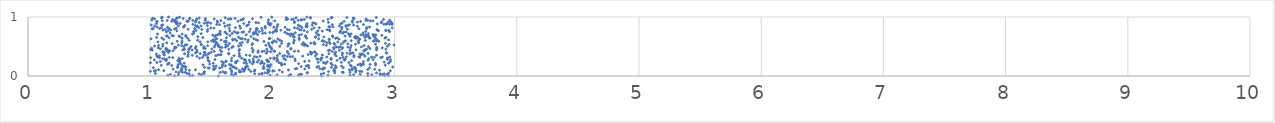
| Category | Series 0 |
|---|---|
| 1.5578485684926808 | 0.001 |
| 2.4021468296798494 | 0.002 |
| 1.1998357419708947 | 0.003 |
| 2.78104376217337 | 0.004 |
| 2.9191206548320117 | 0.005 |
| 1.3246831895094342 | 0.006 |
| 2.9477063046077236 | 0.007 |
| 2.134374419184975 | 0.008 |
| 1.3465346191536143 | 0.009 |
| 1.682977754322935 | 0.01 |
| 1.1446742396201925 | 0.011 |
| 2.455442234134602 | 0.012 |
| 2.2146290130650352 | 0.013 |
| 2.6353675552219995 | 0.014 |
| 1.9809452256569517 | 0.015 |
| 1.2295937864468214 | 0.016 |
| 2.1471356819299565 | 0.017 |
| 2.880128833362008 | 0.018 |
| 2.0380045133074107 | 0.019 |
| 2.6643417995098453 | 0.02 |
| 2.813670925658935 | 0.021 |
| 1.4185499798562946 | 0.022 |
| 2.2285990304879846 | 0.023 |
| 2.1488829586303684 | 0.024 |
| 2.90116098919503 | 0.025 |
| 1.6652909543498882 | 0.026 |
| 1.1657659649259882 | 0.027 |
| 2.2390088964335755 | 0.028 |
| 2.2272227793293915 | 0.029 |
| 2.719198611433096 | 0.03 |
| 2.938714307007358 | 0.031 |
| 1.8930000986881255 | 0.032 |
| 1.7009280996627505 | 0.033 |
| 2.399816477791193 | 0.034 |
| 1.914546944495643 | 0.035 |
| 1.3996847568871496 | 0.036 |
| 2.8828689980413706 | 0.037 |
| 2.9142030677309414 | 0.038 |
| 1.8552242239795202 | 0.039 |
| 1.4410366417329508 | 0.04 |
| 1.317693887241605 | 0.041 |
| 1.0422932186790828 | 0.042 |
| 2.7805935779101834 | 0.043 |
| 1.9145371011594485 | 0.044 |
| 1.3003144363732089 | 0.045 |
| 2.419872586109637 | 0.046 |
| 1.6986009966757687 | 0.047 |
| 2.9512743321165678 | 0.048 |
| 1.9598447148696003 | 0.049 |
| 1.615598879545639 | 0.05 |
| 2.282903807387162 | 0.051 |
| 1.4382426619922037 | 0.052 |
| 2.8519539264998706 | 0.053 |
| 2.5102357027759004 | 0.054 |
| 1.9388505423119102 | 0.055 |
| 1.2342317042883906 | 0.056 |
| 1.6090834345995968 | 0.057 |
| 2.2871483589697514 | 0.058 |
| 1.6172689604497017 | 0.059 |
| 1.5719534413331901 | 0.06 |
| 2.5799137948425996 | 0.061 |
| 1.2850590477027402 | 0.062 |
| 1.2641224725272608 | 0.063 |
| 2.6348167754193694 | 0.064 |
| 2.571557964954439 | 0.065 |
| 1.6671864783275812 | 0.066 |
| 2.080804024978912 | 0.067 |
| 2.6814982386042256 | 0.068 |
| 1.7303004847955676 | 0.069 |
| 1.2112316547413358 | 0.07 |
| 1.7437038602864736 | 0.071 |
| 1.5946967025629413 | 0.072 |
| 1.4440063008681536 | 0.073 |
| 1.9654854305564056 | 0.074 |
| 2.4590504082200506 | 0.075 |
| 2.7319455075718286 | 0.076 |
| 1.8236855455238552 | 0.077 |
| 1.0019311524802037 | 0.078 |
| 1.9733177906248387 | 0.079 |
| 1.7672673230771518 | 0.08 |
| 2.7154262908596367 | 0.081 |
| 1.8528923769018142 | 0.082 |
| 2.5069160436196904 | 0.083 |
| 1.0329827102418665 | 0.084 |
| 2.002812714391278 | 0.085 |
| 1.2500863670526146 | 0.086 |
| 2.014394263445033 | 0.087 |
| 2.9653079881868742 | 0.088 |
| 1.665969582122249 | 0.089 |
| 2.5021055321567123 | 0.09 |
| 1.1113589810225726 | 0.091 |
| 2.683722778653887 | 0.092 |
| 2.5099194654093653 | 0.093 |
| 1.0448095525394112 | 0.094 |
| 1.7302665351392317 | 0.095 |
| 1.3216100271213904 | 0.096 |
| 2.8761957315116176 | 0.097 |
| 1.7691273750013718 | 0.098 |
| 2.0572255141160554 | 0.099 |
| 1.9727391391288616 | 0.1 |
| 2.130963087846583 | 0.101 |
| 1.8562927816258021 | 0.102 |
| 1.9601881142101123 | 0.103 |
| 2.6308190714786823 | 0.104 |
| 2.6526713150951293 | 0.105 |
| 1.3705415242713028 | 0.106 |
| 1.0683913953960749 | 0.107 |
| 1.2586599696806546 | 0.108 |
| 2.7801184904632805 | 0.109 |
| 1.8058474324382008 | 0.11 |
| 1.29195746173539 | 0.111 |
| 1.5228155810161548 | 0.112 |
| 1.516238993882289 | 0.113 |
| 2.410227106205448 | 0.114 |
| 2.8371820767351466 | 0.115 |
| 1.7722535570027482 | 0.116 |
| 1.1874900986576005 | 0.117 |
| 2.2651896956096573 | 0.118 |
| 1.7548064741349167 | 0.119 |
| 2.679974805918337 | 0.12 |
| 2.1869572691300565 | 0.121 |
| 2.388184768098579 | 0.122 |
| 2.5070259366603347 | 0.123 |
| 2.653511136939991 | 0.124 |
| 1.6549072702332834 | 0.125 |
| 1.77650625124326 | 0.126 |
| 2.200034867624352 | 0.127 |
| 1.7058010899386 | 0.128 |
| 1.9243559894583877 | 0.129 |
| 1.2576079139863958 | 0.13 |
| 1.9314855242088642 | 0.131 |
| 2.427224145257079 | 0.132 |
| 1.5327267273030412 | 0.133 |
| 2.415058527449329 | 0.134 |
| 1.483257084275938 | 0.135 |
| 1.5682186470448254 | 0.136 |
| 1.4743884567263161 | 0.137 |
| 2.794724925660654 | 0.138 |
| 2.2986811815186656 | 0.139 |
| 2.5799574271186305 | 0.14 |
| 1.0249596340624014 | 0.141 |
| 2.6760838782083134 | 0.142 |
| 1.6919242739450802 | 0.143 |
| 1.2234940689168237 | 0.144 |
| 2.482693398241122 | 0.145 |
| 2.522502508642797 | 0.146 |
| 2.6729600380919294 | 0.147 |
| 1.44483871654085 | 0.148 |
| 1.9761605158170572 | 0.149 |
| 2.36313140573916 | 0.15 |
| 1.5883110087278687 | 0.151 |
| 1.2850662768149048 | 0.152 |
| 2.9838591676103565 | 0.153 |
| 1.7827708395729664 | 0.154 |
| 1.6757578062480663 | 0.155 |
| 1.6761705910316909 | 0.156 |
| 1.2909437625068252 | 0.157 |
| 1.7839343315833962 | 0.158 |
| 2.235342925083661 | 0.159 |
| 1.9267032543269964 | 0.16 |
| 1.797607885240957 | 0.161 |
| 2.3775083111715247 | 0.162 |
| 1.2742801698670883 | 0.163 |
| 1.9616412355512178 | 0.164 |
| 1.5180419064302653 | 0.165 |
| 1.2261876447030278 | 0.166 |
| 2.6460719507644237 | 0.167 |
| 2.5662994062065296 | 0.168 |
| 1.979420653466727 | 0.169 |
| 1.5398936742894351 | 0.17 |
| 2.276844840563737 | 0.171 |
| 1.6161517160982897 | 0.172 |
| 1.2640434442275676 | 0.173 |
| 2.515664941491801 | 0.174 |
| 2.2957473370705603 | 0.175 |
| 2.726420672694719 | 0.176 |
| 1.1766522555262804 | 0.177 |
| 1.5910960595094434 | 0.178 |
| 2.289374735117619 | 0.179 |
| 1.9621822214269196 | 0.18 |
| 1.0905789269629957 | 0.181 |
| 2.923744777428043 | 0.182 |
| 1.6595947284944057 | 0.183 |
| 2.636738841624166 | 0.184 |
| 2.844277652241945 | 0.185 |
| 2.0786312377740552 | 0.186 |
| 2.4907457470029923 | 0.187 |
| 1.6620618459818006 | 0.188 |
| 1.4315850901080347 | 0.189 |
| 2.7006257807285596 | 0.19 |
| 2.074599132445179 | 0.191 |
| 2.7266975429787905 | 0.192 |
| 1.9868499247334428 | 0.193 |
| 1.648273241900906 | 0.194 |
| 1.2293874838040304 | 0.195 |
| 2.7989765243779283 | 0.196 |
| 1.594420457697746 | 0.197 |
| 2.7431726496624336 | 0.198 |
| 1.1414178629726213 | 0.199 |
| 2.740804093161112 | 0.2 |
| 1.4875650121836468 | 0.201 |
| 2.0998852414901057 | 0.202 |
| 2.7185339802062596 | 0.203 |
| 2.7433772231263847 | 0.204 |
| 1.250948374736513 | 0.205 |
| 1.8376127220877632 | 0.206 |
| 1.7887971846514086 | 0.207 |
| 1.1514058077877358 | 0.208 |
| 2.2144867363446394 | 0.209 |
| 1.931981203095362 | 0.21 |
| 1.9021810929408256 | 0.211 |
| 2.436232793526475 | 0.212 |
| 2.480010176111634 | 0.213 |
| 2.843357056201497 | 0.214 |
| 2.9496238260370755 | 0.215 |
| 1.515509614477633 | 0.216 |
| 1.278398236189356 | 0.217 |
| 2.072593150076293 | 0.218 |
| 1.1549011402143856 | 0.219 |
| 1.9149403804478853 | 0.22 |
| 1.7672253800203723 | 0.221 |
| 2.422125173084752 | 0.222 |
| 1.7009997496777367 | 0.223 |
| 1.0019735280699538 | 0.224 |
| 1.699409984326314 | 0.225 |
| 2.054388305546783 | 0.226 |
| 1.601989530291157 | 0.227 |
| 2.6259547129489995 | 0.228 |
| 1.0553562812541413 | 0.229 |
| 2.4184198711006255 | 0.23 |
| 2.3748675005087936 | 0.231 |
| 2.5645989365082924 | 0.232 |
| 1.8170928128210848 | 0.233 |
| 1.2415106975760846 | 0.234 |
| 2.9150379907534387 | 0.235 |
| 1.8487898797783977 | 0.236 |
| 1.6986260586754618 | 0.237 |
| 1.8764946082543381 | 0.238 |
| 1.7834150242587963 | 0.239 |
| 2.449160733734085 | 0.24 |
| 1.969173595041663 | 0.241 |
| 2.9649081520859775 | 0.242 |
| 2.7448043833932925 | 0.243 |
| 1.5852728476998748 | 0.244 |
| 1.083023696478145 | 0.245 |
| 1.483561652373297 | 0.246 |
| 1.620811376230353 | 0.247 |
| 2.2639873156740706 | 0.248 |
| 1.9137040345778338 | 0.249 |
| 1.958633391282273 | 0.25 |
| 1.8431285333226932 | 0.251 |
| 2.0365051463136457 | 0.252 |
| 1.6213204281376374 | 0.253 |
| 1.243654526372964 | 0.254 |
| 1.7135377358898498 | 0.255 |
| 2.300809446607733 | 0.256 |
| 1.6647572399428283 | 0.257 |
| 1.1314646852493242 | 0.258 |
| 1.9652795448657687 | 0.259 |
| 2.6479202112557587 | 0.26 |
| 2.1864025659758646 | 0.261 |
| 1.2323325000230885 | 0.262 |
| 1.2257735720137883 | 0.263 |
| 2.5299188363305465 | 0.264 |
| 2.7825354378133076 | 0.265 |
| 1.4729077074935597 | 0.266 |
| 2.5892521757060285 | 0.267 |
| 1.811094768257954 | 0.268 |
| 2.396580323300255 | 0.269 |
| 1.8884263060291502 | 0.27 |
| 2.0433401189183624 | 0.271 |
| 1.0337185678956717 | 0.272 |
| 1.9531371120892456 | 0.273 |
| 1.7783454918185424 | 0.274 |
| 2.9671063382936476 | 0.275 |
| 2.107733032971038 | 0.276 |
| 2.82305332712681 | 0.277 |
| 1.530117069873865 | 0.278 |
| 1.7686077367031767 | 0.279 |
| 2.9418111205859514 | 0.28 |
| 2.5963102539750613 | 0.281 |
| 2.481495547803352 | 0.282 |
| 2.372786723715199 | 0.283 |
| 2.5907052106962434 | 0.284 |
| 1.1336361336402871 | 0.285 |
| 1.2445615244618164 | 0.286 |
| 1.119341655161793 | 0.287 |
| 2.0148905661716983 | 0.288 |
| 1.843384874890879 | 0.289 |
| 2.362860234207819 | 0.29 |
| 2.184597398482745 | 0.291 |
| 2.787822004911545 | 0.292 |
| 1.102693640224266 | 0.293 |
| 2.0954384380144786 | 0.294 |
| 1.2636592722299687 | 0.295 |
| 2.396526527222774 | 0.296 |
| 2.480407618848928 | 0.297 |
| 1.2366284954656248 | 0.298 |
| 2.5529869898435047 | 0.299 |
| 1.9833049062688182 | 0.3 |
| 1.6666050562135921 | 0.301 |
| 1.4042251109455934 | 0.302 |
| 1.7474879243692094 | 0.303 |
| 2.0357205702745294 | 0.304 |
| 2.9410892587267643 | 0.305 |
| 2.0125288538374857 | 0.306 |
| 1.4713145411461817 | 0.307 |
| 2.4054358037419696 | 0.308 |
| 1.0761875321068575 | 0.309 |
| 1.0038251882115274 | 0.31 |
| 2.887244926929121 | 0.311 |
| 1.1843089436449117 | 0.312 |
| 1.4711947132793761 | 0.313 |
| 1.4275072535799438 | 0.314 |
| 2.5763465880181147 | 0.315 |
| 1.156782814826912 | 0.316 |
| 2.716311103176273 | 0.317 |
| 2.8346186159359403 | 0.318 |
| 2.8114370095132664 | 0.319 |
| 1.8736582930788495 | 0.32 |
| 2.9598248194916392 | 0.321 |
| 2.4450251726828336 | 0.322 |
| 2.899281704411078 | 0.323 |
| 1.0595972743934485 | 0.324 |
| 2.6048681707043526 | 0.325 |
| 2.6661852328666065 | 0.326 |
| 2.1453263598959094 | 0.327 |
| 2.7075135338310243 | 0.328 |
| 2.121889591623061 | 0.329 |
| 1.85459801766754 | 0.33 |
| 2.165138892333929 | 0.331 |
| 1.3822530059581069 | 0.332 |
| 1.3085550795429364 | 0.333 |
| 1.7298338146657002 | 0.334 |
| 1.8991528499238777 | 0.335 |
| 2.757708033329113 | 0.336 |
| 2.2477930066777785 | 0.337 |
| 1.0547959634623691 | 0.338 |
| 2.084209249224476 | 0.339 |
| 2.5219787108342873 | 0.34 |
| 2.3516465635052395 | 0.341 |
| 1.0752538339653253 | 0.342 |
| 1.5367329150594082 | 0.343 |
| 1.6858526941610843 | 0.344 |
| 1.7320771952845073 | 0.345 |
| 2.0413044799649915 | 0.346 |
| 2.0998231223259323 | 0.347 |
| 1.8148350180235548 | 0.348 |
| 1.4375901667144433 | 0.349 |
| 1.344671292611956 | 0.35 |
| 2.6673941312036717 | 0.351 |
| 1.453497082714073 | 0.352 |
| 2.8524586091677127 | 0.353 |
| 1.7848976712609361 | 0.354 |
| 2.409182012275596 | 0.355 |
| 1.1163149187353112 | 0.356 |
| 2.572039787829377 | 0.357 |
| 1.5534559886864394 | 0.358 |
| 1.5720817045748596 | 0.359 |
| 1.5783116918531352 | 0.36 |
| 2.7470253368702444 | 0.361 |
| 2.7270502251109203 | 0.362 |
| 1.3111954543743758 | 0.363 |
| 2.29293945875248 | 0.364 |
| 2.509874819385741 | 0.365 |
| 2.723766022600829 | 0.366 |
| 1.1098654295242596 | 0.367 |
| 1.4723206709667802 | 0.368 |
| 2.3641492472432404 | 0.369 |
| 2.3168147733494386 | 0.37 |
| 2.1336007501131053 | 0.371 |
| 1.0502517396640354 | 0.372 |
| 1.6443797256589048 | 0.373 |
| 2.633833781064081 | 0.374 |
| 2.7165689319558455 | 0.375 |
| 2.7325919682180637 | 0.376 |
| 2.462298311993283 | 0.377 |
| 1.2814531486541723 | 0.378 |
| 1.4090915027158728 | 0.379 |
| 2.0601509175862773 | 0.38 |
| 1.7289413212794924 | 0.381 |
| 1.4799336774157021 | 0.382 |
| 2.782433811174811 | 0.383 |
| 1.6403392432612827 | 0.384 |
| 1.9500438331773904 | 0.385 |
| 2.9358632073646467 | 0.386 |
| 2.6424454186976813 | 0.387 |
| 2.6103129792409936 | 0.388 |
| 2.5109836398463585 | 0.389 |
| 2.573216918800969 | 0.39 |
| 1.37132563242546 | 0.391 |
| 2.3237002610121262 | 0.392 |
| 2.3195166829180662 | 0.393 |
| 2.658724649491527 | 0.394 |
| 1.4483029008840114 | 0.395 |
| 2.932721108983742 | 0.396 |
| 1.1164037912109157 | 0.397 |
| 1.1489594894049593 | 0.398 |
| 1.4412270664260773 | 0.399 |
| 2.3519325030151013 | 0.4 |
| 1.8823940130530115 | 0.401 |
| 1.4986744944469068 | 0.402 |
| 2.1230778389055134 | 0.403 |
| 2.518089423945017 | 0.404 |
| 1.3118829636165554 | 0.405 |
| 1.1060837433241282 | 0.406 |
| 1.1035427923039396 | 0.407 |
| 2.3108832457544692 | 0.408 |
| 2.3434371574986237 | 0.409 |
| 1.3845049632917967 | 0.41 |
| 1.8393290898420978 | 0.411 |
| 1.9852160261933505 | 0.412 |
| 1.584257118576397 | 0.413 |
| 1.915725783371261 | 0.414 |
| 2.123257079943218 | 0.415 |
| 1.9600731078945997 | 0.416 |
| 2.488696609066284 | 0.417 |
| 1.5219763835738647 | 0.418 |
| 2.0187667143052486 | 0.419 |
| 2.1812987431323756 | 0.42 |
| 2.21259981236219 | 0.421 |
| 1.932845275145927 | 0.422 |
| 1.1592655438667125 | 0.423 |
| 2.0125402164562436 | 0.424 |
| 2.7473286185268284 | 0.425 |
| 1.8840207185345388 | 0.426 |
| 1.186416466539042 | 0.427 |
| 2.7543990817983848 | 0.428 |
| 1.1363416804566953 | 0.429 |
| 1.7274732537208446 | 0.43 |
| 1.1491848578750432 | 0.431 |
| 2.4577429997640756 | 0.432 |
| 2.6345831996322326 | 0.433 |
| 2.5489403509101005 | 0.434 |
| 1.140624010727608 | 0.435 |
| 1.5742423621099622 | 0.436 |
| 2.4684201088584565 | 0.437 |
| 1.0162218634193665 | 0.438 |
| 1.8426819163189943 | 0.439 |
| 1.34331219421754 | 0.44 |
| 1.3816899101616844 | 0.441 |
| 1.2659778304384983 | 0.442 |
| 2.8520892841636383 | 0.443 |
| 2.6839660503364415 | 0.444 |
| 1.3158431287025227 | 0.445 |
| 2.7591730656343882 | 0.446 |
| 1.1398215080504048 | 0.447 |
| 1.003519289484071 | 0.448 |
| 1.128091139957139 | 0.449 |
| 1.7310517529660236 | 0.45 |
| 1.2802537356749493 | 0.451 |
| 2.7714362411502718 | 0.452 |
| 1.276555171606718 | 0.453 |
| 1.6434155065283989 | 0.454 |
| 2.1510497619722937 | 0.455 |
| 2.9282726522062896 | 0.456 |
| 1.9540172655057473 | 0.457 |
| 1.504541036925658 | 0.458 |
| 1.9935572918604214 | 0.459 |
| 2.5032855916431416 | 0.46 |
| 1.3185659075796934 | 0.461 |
| 1.081867341647914 | 0.462 |
| 2.5700450351925 | 0.463 |
| 1.199266990212583 | 0.464 |
| 1.4499654746114183 | 0.465 |
| 2.797714830799663 | 0.466 |
| 2.1519379324299304 | 0.467 |
| 2.8542888116579945 | 0.468 |
| 1.3235221787880582 | 0.469 |
| 1.0117279104576617 | 0.47 |
| 1.130281102230804 | 0.471 |
| 1.83323034290964 | 0.472 |
| 1.437003565526461 | 0.473 |
| 1.369517039166278 | 0.474 |
| 2.505728037191795 | 0.475 |
| 2.898721855580485 | 0.476 |
| 2.6382271698459934 | 0.477 |
| 1.987530396249518 | 0.478 |
| 1.0657612495477196 | 0.479 |
| 2.5736029685704205 | 0.48 |
| 2.5013579951591165 | 0.481 |
| 1.6676426927932715 | 0.482 |
| 1.586857632483822 | 0.483 |
| 1.2115936980816226 | 0.484 |
| 2.542907011020099 | 0.485 |
| 2.8544127340807934 | 0.486 |
| 1.6166732012005625 | 0.487 |
| 1.5684342412149392 | 0.488 |
| 2.618334360614093 | 0.489 |
| 1.2010295346896627 | 0.49 |
| 2.524445855902427 | 0.491 |
| 1.5254313188307442 | 0.492 |
| 2.729160083017719 | 0.493 |
| 2.5534393063421352 | 0.494 |
| 1.9821072105724789 | 0.495 |
| 1.4398712157195517 | 0.496 |
| 1.2769871230745882 | 0.497 |
| 2.785199661681169 | 0.498 |
| 1.3751954414791536 | 0.499 |
| 1.678576929029321 | 0.5 |
| 1.3345273633524506 | 0.501 |
| 1.5631649799070904 | 0.502 |
| 2.0608582084204263 | 0.503 |
| 1.1026156778690497 | 0.504 |
| 2.9415250524465786 | 0.505 |
| 2.1270488028003545 | 0.506 |
| 1.7231229696117902 | 0.507 |
| 1.0363455104954464 | 0.508 |
| 2.287220091523494 | 0.509 |
| 1.6274740332177 | 0.51 |
| 1.5578705456087298 | 0.511 |
| 1.4703699353918598 | 0.512 |
| 1.2584795641170232 | 0.513 |
| 1.6354797077597232 | 0.514 |
| 2.6439929536022575 | 0.515 |
| 2.2611822448230683 | 0.516 |
| 2.7500236825441897 | 0.517 |
| 1.0685925312524969 | 0.518 |
| 2.441980361261912 | 0.519 |
| 1.9455234189452613 | 0.52 |
| 1.744546914863759 | 0.521 |
| 1.9726358699937663 | 0.522 |
| 1.2299991414793927 | 0.523 |
| 1.5310523195292638 | 0.524 |
| 2.9950241824956896 | 0.525 |
| 1.557166244069799 | 0.526 |
| 2.2740768538651714 | 0.527 |
| 1.285741646136607 | 0.528 |
| 1.419075051348379 | 0.529 |
| 1.300237552120345 | 0.53 |
| 1.6175525743807582 | 0.531 |
| 2.4168059905676387 | 0.532 |
| 2.51093464508866 | 0.533 |
| 1.832801046014133 | 0.534 |
| 2.955992591704476 | 0.535 |
| 2.243223322787589 | 0.536 |
| 2.266403380534379 | 0.537 |
| 2.6807292582754627 | 0.538 |
| 2.843866396194366 | 0.539 |
| 1.104374480074572 | 0.54 |
| 1.4162154300007892 | 0.541 |
| 2.563495434997925 | 0.542 |
| 2.138220060960455 | 0.543 |
| 2.6170086503211483 | 0.544 |
| 2.3496809525138738 | 0.545 |
| 2.130538315038993 | 0.546 |
| 1.8382642539313248 | 0.547 |
| 2.4719788913822294 | 0.548 |
| 1.179954707181031 | 0.549 |
| 2.0746733962605726 | 0.55 |
| 2.3401449538563215 | 0.551 |
| 1.6486970354408284 | 0.552 |
| 2.9259563698205127 | 0.553 |
| 2.504689249711763 | 0.554 |
| 1.7337724169272744 | 0.555 |
| 1.9687601025644166 | 0.556 |
| 2.3135851400780005 | 0.557 |
| 1.5420993872556845 | 0.558 |
| 1.2584241055743166 | 0.559 |
| 1.5460362211158618 | 0.56 |
| 2.706686781574004 | 0.561 |
| 1.1348435450609993 | 0.562 |
| 2.173406945530863 | 0.563 |
| 2.446203326802147 | 0.564 |
| 2.000135057883524 | 0.565 |
| 2.2532211346578688 | 0.566 |
| 2.3420309626799627 | 0.567 |
| 2.5811575553411013 | 0.568 |
| 1.753550214076353 | 0.569 |
| 1.5391646737391345 | 0.57 |
| 2.4665222843478265 | 0.571 |
| 2.173897445617845 | 0.572 |
| 1.9988613827756438 | 0.573 |
| 1.6228566734295082 | 0.574 |
| 1.7975011985765368 | 0.575 |
| 2.535511124469511 | 0.576 |
| 1.0636060880796245 | 0.577 |
| 1.471251353819856 | 0.578 |
| 2.031429497706932 | 0.579 |
| 1.4079411909943573 | 0.58 |
| 1.520264305266223 | 0.581 |
| 2.700701560981731 | 0.582 |
| 2.4271043810971333 | 0.583 |
| 1.606407750070013 | 0.584 |
| 1.9307133333821411 | 0.585 |
| 2.8708521296176412 | 0.586 |
| 2.5887327160055382 | 0.587 |
| 2.8271474699765062 | 0.588 |
| 1.220790026062791 | 0.589 |
| 1.261024470623068 | 0.59 |
| 2.0758283031157747 | 0.591 |
| 2.852041571111399 | 0.592 |
| 2.406294617636333 | 0.593 |
| 1.6195413026575538 | 0.594 |
| 1.5023214106617055 | 0.595 |
| 2.015190540896886 | 0.596 |
| 2.5976952386477485 | 0.597 |
| 2.6449427415476148 | 0.598 |
| 1.7069606010752045 | 0.599 |
| 2.410899869520236 | 0.6 |
| 2.8325720297150303 | 0.601 |
| 2.760718822269694 | 0.602 |
| 2.8597401217012437 | 0.603 |
| 1.879362572871153 | 0.604 |
| 1.3188563246340628 | 0.605 |
| 2.1788487052050938 | 0.606 |
| 1.3877347521560124 | 0.607 |
| 2.059821368689267 | 0.608 |
| 1.5798236269019934 | 0.609 |
| 1.6753000853690454 | 0.61 |
| 2.709530997395996 | 0.611 |
| 1.8028143974801245 | 0.612 |
| 2.951115397326766 | 0.613 |
| 1.5157847629281938 | 0.614 |
| 1.531806044643003 | 0.615 |
| 1.8659635291414995 | 0.616 |
| 2.464348417830565 | 0.617 |
| 2.2197628724268617 | 0.618 |
| 2.7090170970033007 | 0.619 |
| 1.110273074109831 | 0.62 |
| 1.6937875956748945 | 0.621 |
| 1.7776070976101075 | 0.622 |
| 1.6747136018975308 | 0.623 |
| 2.8502276862684166 | 0.624 |
| 2.5449235690124787 | 0.625 |
| 2.4646684326473363 | 0.626 |
| 2.714211338922909 | 0.627 |
| 2.0443048867285443 | 0.628 |
| 2.3789911235763515 | 0.629 |
| 1.007426845870317 | 0.63 |
| 1.5456700674600865 | 0.631 |
| 1.7540381705871824 | 0.632 |
| 1.9732260286017518 | 0.633 |
| 1.8478100421224337 | 0.634 |
| 1.7386049475028005 | 0.635 |
| 1.979849619236217 | 0.636 |
| 2.5164343922383354 | 0.637 |
| 1.2616451024030348 | 0.638 |
| 2.684040117145287 | 0.639 |
| 2.279929151169437 | 0.64 |
| 2.7989433060571898 | 0.641 |
| 2.920989795755224 | 0.642 |
| 1.3057356643684672 | 0.643 |
| 2.7928487574786978 | 0.644 |
| 1.0951017942245178 | 0.645 |
| 2.219956653588037 | 0.646 |
| 2.528803968052343 | 0.647 |
| 1.154595466851527 | 0.648 |
| 1.6239717854166273 | 0.649 |
| 2.677854658898286 | 0.65 |
| 2.8400700046023593 | 0.651 |
| 1.430852647551959 | 0.652 |
| 1.0522600297560487 | 0.653 |
| 2.758192783275268 | 0.654 |
| 2.929146682888928 | 0.655 |
| 2.6966073959116956 | 0.656 |
| 2.3506381155336253 | 0.657 |
| 1.7221935373226571 | 0.658 |
| 2.1707835860773472 | 0.659 |
| 2.788606320060078 | 0.66 |
| 2.673093178665182 | 0.661 |
| 2.420767121366075 | 0.662 |
| 2.179836067284546 | 0.663 |
| 1.5295288091119421 | 0.664 |
| 2.355454627985983 | 0.665 |
| 2.4941641895938833 | 0.666 |
| 1.3894593947365994 | 0.667 |
| 1.2431181690517816 | 0.668 |
| 1.8244280998682594 | 0.669 |
| 2.6831725259664987 | 0.67 |
| 2.2698437284871975 | 0.671 |
| 2.6361037305694355 | 0.672 |
| 2.830509055944967 | 0.673 |
| 1.2908409341878015 | 0.674 |
| 2.773084552313119 | 0.675 |
| 1.1332184873556959 | 0.676 |
| 2.5942108757620934 | 0.677 |
| 1.2354800480748753 | 0.678 |
| 1.1899933552517037 | 0.679 |
| 1.1396807417007888 | 0.68 |
| 2.4912405371839235 | 0.681 |
| 2.147373192399202 | 0.682 |
| 2.271345738999107 | 0.683 |
| 1.1794124788251648 | 0.684 |
| 2.7854449306128872 | 0.685 |
| 1.6528666998730726 | 0.686 |
| 1.5346351545501176 | 0.687 |
| 1.2913031355326823 | 0.688 |
| 2.8953062252466393 | 0.689 |
| 2.745568457970602 | 0.69 |
| 2.3802331423001952 | 0.691 |
| 2.217216688684629 | 0.692 |
| 1.5114608111900065 | 0.693 |
| 2.8461347321610315 | 0.694 |
| 1.5502930946206492 | 0.695 |
| 2.8322570474420115 | 0.696 |
| 2.6295843267350727 | 0.697 |
| 2.7242077541076646 | 0.698 |
| 1.7864064975143652 | 0.699 |
| 2.762817929262742 | 0.7 |
| 1.8788398284339356 | 0.701 |
| 2.1673689839532386 | 0.702 |
| 2.2372652104714685 | 0.703 |
| 2.8227433458332962 | 0.704 |
| 1.5736496706796992 | 0.705 |
| 2.371134964131792 | 0.706 |
| 2.168917033331387 | 0.707 |
| 1.345458958632219 | 0.708 |
| 1.844228516448972 | 0.709 |
| 2.1349497183066433 | 0.71 |
| 1.2618920287737039 | 0.711 |
| 1.628994588003974 | 0.712 |
| 1.060016979974696 | 0.713 |
| 2.6436449971709997 | 0.714 |
| 1.5663183876585502 | 0.715 |
| 2.156120481388158 | 0.716 |
| 1.4171181819427632 | 0.717 |
| 2.622708497046098 | 0.718 |
| 2.784792174503832 | 0.719 |
| 2.1193477517920716 | 0.72 |
| 1.8548802712030206 | 0.721 |
| 1.670121744463841 | 0.722 |
| 1.920835544303955 | 0.723 |
| 2.5747573702930255 | 0.724 |
| 1.8671213188586484 | 0.725 |
| 1.3575267142117688 | 0.726 |
| 1.9416743296589638 | 0.727 |
| 1.1633851577274128 | 0.728 |
| 1.7147934762765304 | 0.729 |
| 1.570707656545409 | 0.73 |
| 2.742163820114815 | 0.731 |
| 1.7065820079180432 | 0.732 |
| 2.1876909236539355 | 0.733 |
| 1.7184074446718638 | 0.734 |
| 2.35807429339145 | 0.735 |
| 1.8449806887563458 | 0.736 |
| 1.979121927436877 | 0.737 |
| 2.0029338269410424 | 0.738 |
| 2.551753362012442 | 0.739 |
| 1.6148371247871174 | 0.74 |
| 1.752544851711544 | 0.741 |
| 2.1014435317043993 | 0.742 |
| 2.583925409311285 | 0.743 |
| 1.6120804794078805 | 0.744 |
| 2.6025246152576837 | 0.745 |
| 2.2867052218143753 | 0.746 |
| 1.76515756242468 | 0.747 |
| 1.1326130887226382 | 0.748 |
| 1.8117855462925805 | 0.749 |
| 2.9588837235487038 | 0.75 |
| 1.8927840186430887 | 0.751 |
| 2.558143487379368 | 0.752 |
| 1.6876515868619781 | 0.753 |
| 1.3550987062487312 | 0.754 |
| 2.7632880396690926 | 0.755 |
| 2.0178126541853088 | 0.756 |
| 2.0341554953499834 | 0.757 |
| 1.4677988207082426 | 0.758 |
| 2.554511262954936 | 0.759 |
| 1.5724091861681033 | 0.76 |
| 2.408417805608444 | 0.761 |
| 2.4705979550967023 | 0.762 |
| 1.8645771807381788 | 0.763 |
| 1.651274874419584 | 0.764 |
| 1.218305045401034 | 0.765 |
| 2.3720400958395973 | 0.766 |
| 2.866853756052884 | 0.767 |
| 1.9173032467704938 | 0.768 |
| 1.1469940070605895 | 0.769 |
| 2.928276574412732 | 0.77 |
| 1.3742246548714794 | 0.771 |
| 2.25998469680128 | 0.772 |
| 2.9524333317690243 | 0.773 |
| 2.9279236772334665 | 0.774 |
| 2.8638289406446855 | 0.775 |
| 2.069491521971453 | 0.776 |
| 1.8708300121971584 | 0.777 |
| 1.1057340199115981 | 0.778 |
| 1.1673334674547349 | 0.779 |
| 2.2349386009129715 | 0.78 |
| 2.4654658473597633 | 0.781 |
| 2.0270643421761187 | 0.782 |
| 2.1387928205904614 | 0.783 |
| 2.446981129819185 | 0.784 |
| 2.8552960321685377 | 0.785 |
| 2.2225807491230336 | 0.786 |
| 2.121066464762001 | 0.787 |
| 1.4710110335019937 | 0.788 |
| 1.4226093320510236 | 0.789 |
| 2.3213828400105925 | 0.79 |
| 1.1227754902556375 | 0.791 |
| 2.614206478918348 | 0.792 |
| 1.3104989184916476 | 0.793 |
| 1.8199457962636194 | 0.794 |
| 2.032651303137494 | 0.795 |
| 1.198651192371063 | 0.796 |
| 1.0159039636581737 | 0.797 |
| 2.5676732388842067 | 0.798 |
| 1.8771960867262398 | 0.799 |
| 2.708301418975634 | 0.8 |
| 2.770865112595232 | 0.801 |
| 1.3643006211686133 | 0.802 |
| 1.0241748881808304 | 0.803 |
| 1.0776957407559318 | 0.804 |
| 1.868737632042121 | 0.805 |
| 1.155047674883216 | 0.806 |
| 1.913954317862165 | 0.807 |
| 1.6469869409955282 | 0.808 |
| 2.204992605375013 | 0.809 |
| 1.7387202655166365 | 0.81 |
| 1.5221898544861086 | 0.811 |
| 1.2135739907123266 | 0.812 |
| 2.9802647920036067 | 0.813 |
| 1.496090855146965 | 0.814 |
| 1.9425074386183825 | 0.815 |
| 2.340297642394137 | 0.816 |
| 2.1806500196946743 | 0.817 |
| 2.383334140714103 | 0.818 |
| 1.0930905636074548 | 0.819 |
| 1.697099824930413 | 0.82 |
| 1.3975756796521186 | 0.821 |
| 2.241288161548961 | 0.822 |
| 2.771412018072347 | 0.823 |
| 2.5678264034971123 | 0.824 |
| 1.1409349786872396 | 0.825 |
| 2.1035892656931185 | 0.826 |
| 2.012698360327726 | 0.827 |
| 1.0571624296128075 | 0.828 |
| 1.2726891191793392 | 0.829 |
| 2.795343424621564 | 0.83 |
| 2.471740240989183 | 0.831 |
| 1.2747674990774207 | 0.832 |
| 2.4969491835444932 | 0.833 |
| 1.3846048171606289 | 0.834 |
| 2.2752553494250174 | 0.835 |
| 2.461935946818153 | 0.836 |
| 1.3855039153256554 | 0.837 |
| 2.0392216295099175 | 0.838 |
| 2.602798916868384 | 0.839 |
| 1.9408842771403327 | 0.84 |
| 2.286324555825103 | 0.841 |
| 1.6114852819800771 | 0.842 |
| 2.69541115885064 | 0.843 |
| 1.0358697129157017 | 0.844 |
| 1.384230795130765 | 0.845 |
| 2.2256569443932634 | 0.846 |
| 1.416321008905472 | 0.847 |
| 1.7321643878728001 | 0.848 |
| 2.5483784770179483 | 0.849 |
| 1.2313011033054084 | 0.85 |
| 2.2798866307946986 | 0.851 |
| 1.790256723631974 | 0.852 |
| 2.601310321490076 | 0.853 |
| 1.4678249458566248 | 0.854 |
| 1.3699655489454978 | 0.855 |
| 1.2825777498825355 | 0.856 |
| 1.0925539757169516 | 0.857 |
| 1.6341897673748638 | 0.858 |
| 2.6184940426840906 | 0.859 |
| 2.325271215264552 | 0.86 |
| 2.211274927438801 | 0.861 |
| 1.982960684451656 | 0.862 |
| 2.6644797300966503 | 0.863 |
| 1.0089497410679742 | 0.864 |
| 1.6496096368464117 | 0.865 |
| 1.1030798732467084 | 0.866 |
| 2.2792453178689867 | 0.867 |
| 2.62983928333358 | 0.868 |
| 1.803375633877977 | 0.869 |
| 2.489303046666997 | 0.87 |
| 1.5663267496976219 | 0.871 |
| 2.0432170647577204 | 0.872 |
| 2.745300483772283 | 0.873 |
| 1.5437855086650352 | 0.874 |
| 2.9794944093034306 | 0.875 |
| 1.3499417822625137 | 0.876 |
| 2.9125184010673744 | 0.877 |
| 2.958357380658467 | 0.878 |
| 2.92792803035149 | 0.879 |
| 1.9680062412412695 | 0.88 |
| 2.936503761868875 | 0.881 |
| 2.35672376306335 | 0.882 |
| 2.8588830297158916 | 0.883 |
| 1.050416000426514 | 0.884 |
| 1.2159470281149596 | 0.885 |
| 2.5595994140711875 | 0.886 |
| 2.2837629148080087 | 0.887 |
| 1.9866690725066545 | 0.888 |
| 1.7657405843857303 | 0.889 |
| 1.2458470771635866 | 0.89 |
| 1.9689216758433192 | 0.891 |
| 1.4950142859367652 | 0.892 |
| 1.4434840328031793 | 0.893 |
| 2.979216669333507 | 0.894 |
| 1.222773160214635 | 0.895 |
| 1.604637405838311 | 0.896 |
| 2.569859896459292 | 0.897 |
| 1.4640443718379104 | 0.898 |
| 2.344541056067878 | 0.899 |
| 2.3300039233966716 | 0.9 |
| 1.8862544445128198 | 0.901 |
| 2.890919472886195 | 0.902 |
| 2.972877267926311 | 0.903 |
| 1.2092429662358253 | 0.904 |
| 2.1807613614081536 | 0.905 |
| 1.8655221345993767 | 0.906 |
| 1.4010761603938613 | 0.907 |
| 1.9659633174102702 | 0.908 |
| 2.4580859968983937 | 0.909 |
| 2.654097156545683 | 0.91 |
| 2.9468272247235388 | 0.911 |
| 1.4752402394818622 | 0.912 |
| 1.8108970267688211 | 0.913 |
| 2.6963716835194362 | 0.914 |
| 1.5508353278176217 | 0.915 |
| 1.2095943617874159 | 0.916 |
| 1.370412321924476 | 0.917 |
| 2.89409445588264 | 0.918 |
| 1.218362492454964 | 0.919 |
| 1.0562860340504963 | 0.92 |
| 2.180164767006792 | 0.921 |
| 2.9690659194748745 | 0.922 |
| 1.0522296652850691 | 0.923 |
| 2.7219862559163968 | 0.924 |
| 1.3061609228742272 | 0.925 |
| 2.5862751445593286 | 0.926 |
| 1.1763824787793202 | 0.927 |
| 1.7183157828285687 | 0.928 |
| 1.5482685610348124 | 0.929 |
| 1.1968998133409272 | 0.93 |
| 1.2998162712509425 | 0.931 |
| 2.4158318735633584 | 0.932 |
| 2.8227223181314103 | 0.933 |
| 2.020185578398811 | 0.934 |
| 2.8022022809740434 | 0.935 |
| 1.312030997785339 | 0.936 |
| 1.0994503954920998 | 0.937 |
| 2.655419451205389 | 0.938 |
| 1.5785177569063091 | 0.939 |
| 1.1391328852210507 | 0.94 |
| 1.3482716379441668 | 0.941 |
| 2.76524851759475 | 0.942 |
| 2.210816178960635 | 0.943 |
| 1.4504483382827595 | 0.944 |
| 2.7795798180701166 | 0.945 |
| 1.3765883824055545 | 0.946 |
| 2.9595090989227213 | 0.947 |
| 1.0129675459934986 | 0.948 |
| 2.232590671932869 | 0.949 |
| 1.741455861068442 | 0.95 |
| 2.241850517792383 | 0.951 |
| 1.9685543225702287 | 0.952 |
| 1.204178103563696 | 0.953 |
| 2.2399198569292595 | 0.954 |
| 2.1126670845403 | 0.955 |
| 1.7562695361947052 | 0.956 |
| 1.1830406361742634 | 0.957 |
| 2.909414780383538 | 0.958 |
| 2.156779464601087 | 0.959 |
| 2.2616430702786303 | 0.96 |
| 2.45447650763837 | 0.961 |
| 2.1719443905224702 | 0.962 |
| 1.637909543259839 | 0.963 |
| 1.6618030277721532 | 0.964 |
| 2.125072213269898 | 0.965 |
| 2.766244775986851 | 0.966 |
| 1.3807743908176862 | 0.967 |
| 1.5241795972081476 | 0.968 |
| 1.0356402895491983 | 0.969 |
| 1.7625143081974672 | 0.97 |
| 1.8370646801453536 | 0.971 |
| 1.655587279519794 | 0.972 |
| 1.4520197678326385 | 0.973 |
| 2.669093450532526 | 0.974 |
| 1.2698389781246011 | 0.975 |
| 1.3236507755313716 | 0.976 |
| 1.6950113496358765 | 0.977 |
| 1.3237465374539137 | 0.978 |
| 1.0196224896095256 | 0.979 |
| 1.2176198037863386 | 0.98 |
| 2.3115149546400255 | 0.981 |
| 2.6616018879211034 | 0.982 |
| 1.4011559980562394 | 0.983 |
| 1.2210532582145939 | 0.984 |
| 2.481245601686425 | 0.985 |
| 1.0925282516136345 | 0.986 |
| 2.1939319302642497 | 0.987 |
| 1.6141249193892704 | 0.988 |
| 2.1135985768408623 | 0.989 |
| 1.0980737795756343 | 0.99 |
| 2.609234587639884 | 0.991 |
| 2.849660367364556 | 0.992 |
| 2.3105726996976657 | 0.993 |
| 1.9068661647376994 | 0.994 |
| 2.4875789613409394 | 0.995 |
| 1.2398931204002637 | 0.996 |
| 1.0956004724764727 | 0.997 |
| 1.9942217977947916 | 0.998 |
| 2.282917131557136 | 0.999 |
| 1.1501046042062892 | 1 |